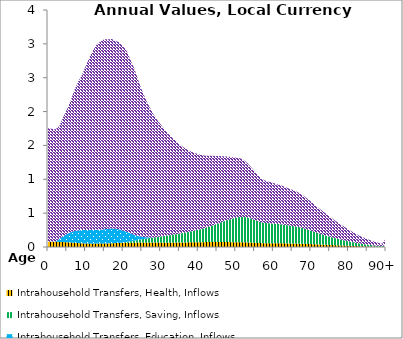
| Category | Intrahousehold Transfers, Health, Inflows | Intrahousehold Transfers, Saving, Inflows | Intrahousehold Transfers, Education, Inflows | Intrahousehold Transfers, Consumption other than health and education, Inflows |
|---|---|---|---|---|
| 0 | 81.379 | 0 | 0 | 1672.328 |
|  | 79.467 | 0 | 0 | 1664.81 |
| 2 | 77.737 | 0 | 3.429 | 1657.241 |
| 3 | 75.866 | 0 | 43.683 | 1665.078 |
| 4 | 73.118 | 0 | 83.62 | 1754.845 |
| 5 | 70.368 | 0 | 120.62 | 1836.749 |
| 6 | 66.923 | 0 | 151.01 | 1938.389 |
| 7 | 62.437 | 0 | 173.195 | 2079.889 |
| 8 | 57.841 | 0 | 186.938 | 2192.487 |
| 9 | 54.583 | 0 | 196.394 | 2285.817 |
| 10 | 51.989 | 0 | 198.992 | 2416.214 |
| 11 | 49.932 | 0 | 200.98 | 2547.895 |
| 12 | 49.707 | 0 | 201.078 | 2654.984 |
| 13 | 50.2 | 0 | 202.866 | 2739.18 |
| 14 | 50.641 | 0 | 205.049 | 2780.296 |
| 15 | 51.494 | 0 | 211.496 | 2805.46 |
| 16 | 53.655 | 0 | 214.784 | 2799.697 |
| 17 | 55.717 | 0 | 218.085 | 2796.731 |
| 18 | 57.602 | 0 | 210.905 | 2774.092 |
| 19 | 59.845 | 0 | 201.171 | 2762.227 |
| 20 | 61.812 | 3.158 | 175.216 | 2723.748 |
| 21 | 62.854 | 11.953 | 149.117 | 2667.103 |
| 22 | 63.569 | 20.413 | 116.393 | 2560.558 |
| 23 | 64.476 | 29.198 | 86.314 | 2451.927 |
| 24 | 64.73 | 38.441 | 57.841 | 2308.912 |
| 25 | 65.009 | 48.339 | 36.375 | 2166.921 |
| 26 | 65.527 | 57.489 | 21.01 | 2042.145 |
| 27 | 65.879 | 65.834 | 9.227 | 1931.569 |
| 28 | 65.435 | 73.387 | 0 | 1827.861 |
| 29 | 65.338 | 81.294 | 0 | 1735.912 |
| 30 | 64.853 | 90.069 | 0 | 1656.221 |
| 31 | 64.498 | 97.716 | 0 | 1577.036 |
| 32 | 64.391 | 105.677 | 0 | 1503.289 |
| 33 | 64.749 | 114.919 | 0 | 1439.533 |
| 34 | 65.67 | 122.91 | 0 | 1378.021 |
| 35 | 66.626 | 129.981 | 0 | 1318.184 |
| 36 | 67.361 | 139.912 | 0 | 1268.372 |
| 37 | 68.293 | 149.972 | 0 | 1223.093 |
| 38 | 69.207 | 160.973 | 0 | 1182.41 |
| 39 | 69.551 | 172.608 | 0 | 1146.818 |
| 40 | 70.332 | 185.959 | 0 | 1115.39 |
| 41 | 71.35 | 197.499 | 0 | 1088.06 |
| 42 | 72.445 | 210.689 | 0 | 1065.406 |
| 43 | 73.057 | 228.762 | 0 | 1044.474 |
| 44 | 74.009 | 247.333 | 0 | 1024.454 |
| 45 | 74.333 | 266.946 | 0 | 1003.811 |
| 46 | 73.711 | 288.614 | 0 | 979.678 |
| 47 | 72.894 | 309.346 | 0 | 954.645 |
| 48 | 72.296 | 329.707 | 0 | 932.481 |
| 49 | 71.592 | 346.171 | 0 | 910.007 |
| 50 | 70.877 | 361.112 | 0 | 888.918 |
| 51 | 70.501 | 372.879 | 0 | 869.482 |
| 52 | 69.514 | 374.622 | 0 | 843.095 |
| 53 | 67.816 | 370.253 | 0 | 806.83 |
| 54 | 65.046 | 355.294 | 0 | 764.577 |
| 55 | 62.361 | 337.545 | 0 | 722.617 |
| 56 | 59.062 | 319.53 | 0 | 678.175 |
| 57 | 56.61 | 305.039 | 0 | 641.93 |
| 58 | 55.63 | 298.071 | 0 | 621.526 |
| 59 | 55.9 | 294.652 | 0 | 611.243 |
| 60 | 55.711 | 290.353 | 0 | 598.975 |
| 61 | 55.436 | 285.646 | 0 | 587.447 |
| 62 | 54.8 | 280.181 | 0 | 575.941 |
| 63 | 53.831 | 274.27 | 0 | 562.565 |
| 64 | 52.841 | 266.603 | 0 | 547.286 |
| 65 | 51.893 | 260.409 | 0 | 533.652 |
| 66 | 50.831 | 252.204 | 0 | 520.502 |
| 67 | 49.397 | 241.881 | 0 | 503.775 |
| 68 | 47.478 | 228.916 | 0 | 481.832 |
| 69 | 45.148 | 214.009 | 0 | 456.318 |
| 70 | 42.854 | 198.262 | 0 | 430.325 |
| 71 | 40.475 | 181.688 | 0 | 403.503 |
| 72 | 38.052 | 165.298 | 0 | 376.31 |
| 73 | 35.651 | 150.279 | 0 | 349.507 |
| 74 | 33.171 | 136.079 | 0 | 323.087 |
| 75 | 30.623 | 122.759 | 0 | 296.41 |
| 76 | 28.035 | 109.812 | 0 | 270.11 |
| 77 | 25.517 | 97.625 | 0 | 244.786 |
| 78 | 23.127 | 86.367 | 0 | 220.795 |
| 79 | 20.841 | 75.954 | 0 | 197.866 |
| 80 | 18.534 | 66.105 | 0 | 175.232 |
| 81 | 16.204 | 56.579 | 0 | 152.896 |
| 82 | 14.027 | 47.732 | 0 | 132.137 |
| 83 | 12.079 | 39.952 | 0 | 113.549 |
| 84 | 10.373 | 32.953 | 0 | 97.048 |
| 85 | 8.775 | 26.645 | 0 | 81.767 |
| 86 | 7.297 | 21.066 | 0 | 67.868 |
| 87 | 5.981 | 16.324 | 0 | 55.343 |
| 88 | 4.844 | 12.404 | 0 | 43.641 |
| 89 | 3.87 | 9.262 | 0 | 34.095 |
| 90+ | 11.009 | 24.564 | 0 | 94.88 |